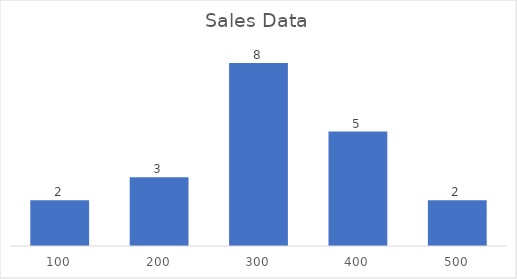
| Category | Series 0 |
|---|---|
| 100.0 | 2 |
| 200.0 | 3 |
| 300.0 | 8 |
| 400.0 | 5 |
| 500.0 | 2 |